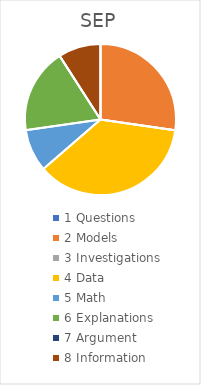
| Category | SEP |
|---|---|
| 1 Questions | 0 |
| 2 Models | 0.273 |
| 3 Investigations | 0 |
| 4 Data | 0.364 |
| 5 Math | 0.091 |
| 6 Explanations | 0.182 |
| 7 Argument | 0 |
| 8 Information | 0.091 |